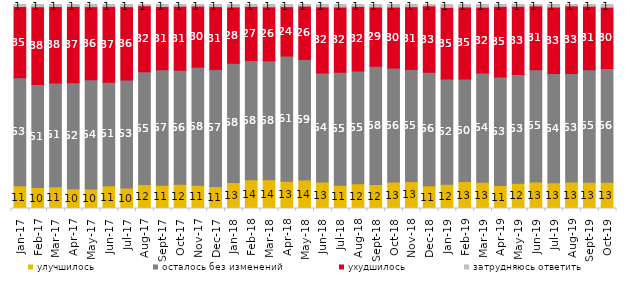
| Category | улучшилось | осталось без изменений | ухудшилось | затрудняюсь ответить |
|---|---|---|---|---|
| 2017-01-01 | 11.15 | 53 | 34.85 | 1 |
| 2017-02-01 | 10.25 | 50.5 | 38.15 | 1.1 |
| 2017-03-01 | 10.7 | 50.75 | 37.5 | 1 |
| 2017-04-01 | 9.7 | 51.95 | 37.4 | 0.95 |
| 2017-05-01 | 9.5 | 53.65 | 35.8 | 1.05 |
| 2017-06-01 | 11.2 | 50.7 | 37.15 | 0.95 |
| 2017-07-01 | 10.05 | 52.95 | 35.95 | 1.05 |
| 2017-08-01 | 11.8 | 55.2 | 32.4 | 0.6 |
| 2017-09-01 | 11.35 | 56.7 | 30.95 | 1 |
| 2017-10-01 | 11.9 | 55.9 | 31.35 | 0.85 |
| 2017-11-01 | 11.45 | 57.85 | 29.9 | 0.8 |
| 2017-12-01 | 10.8 | 57.35 | 30.8 | 1.05 |
| 2018-01-01 | 12.75 | 58.45 | 27.6 | 1.2 |
| 2018-02-01 | 14.1 | 58.4 | 26.55 | 0.95 |
| 2018-03-01 | 14.1 | 58.3 | 26.45 | 1.15 |
| 2018-04-01 | 13.35 | 61.4 | 24.2 | 1.05 |
| 2018-05-01 | 14 | 59.1 | 26.1 | 0.8 |
| 2018-06-01 | 12.95 | 53.5 | 32.4 | 1.15 |
| 2018-07-01 | 11.45 | 55.3 | 32 | 1.25 |
| 2018-08-01 | 12.1 | 55.25 | 31.7 | 0.95 |
| 2018-09-01 | 11.75 | 58 | 29 | 1.25 |
| 2018-10-01 | 12.95 | 55.9 | 29.9 | 1.25 |
| 2018-11-01 | 13.273 | 54.84 | 30.788 | 1.098 |
| 2018-12-01 | 11.2 | 55.6 | 32.55 | 0.65 |
| 2019-01-01 | 11.85 | 51.6 | 35.15 | 1.4 |
| 2019-02-01 | 13.2 | 50.3 | 35.3 | 1.2 |
| 2019-03-01 | 12.929 | 53.506 | 32.273 | 1.293 |
| 2019-04-01 | 11.238 | 53.168 | 34.653 | 0.941 |
| 2019-05-01 | 12.432 | 53.244 | 33.432 | 0.892 |
| 2019-06-01 | 13.017 | 54.963 | 31.322 | 0.698 |
| 2019-07-01 | 12.624 | 53.564 | 32.574 | 1.238 |
| 2019-08-01 | 12.937 | 53.197 | 33.167 | 0.699 |
| 2019-09-01 | 12.871 | 55.149 | 31.139 | 0.842 |
| 2019-10-01 | 12.921 | 55.693 | 30.05 | 1.337 |